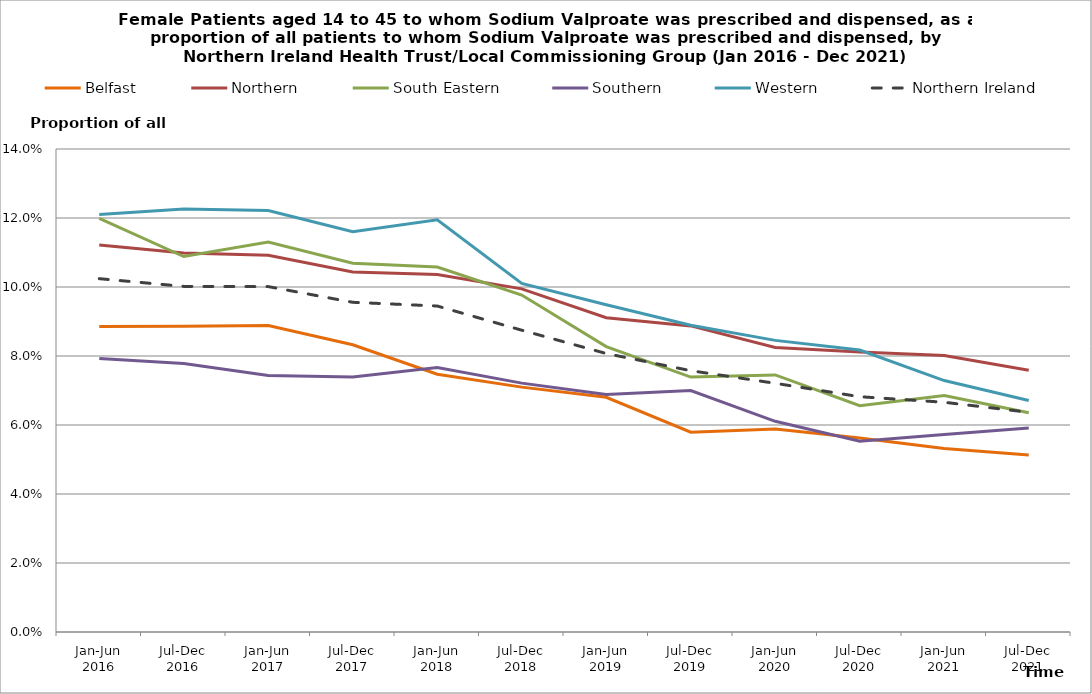
| Category | Belfast | Northern | South Eastern | Southern | Western | Northern Ireland |
|---|---|---|---|---|---|---|
| Jan-Jun 2016 | 0.089 | 0.112 | 0.12 | 0.079 | 0.121 | 0.102 |
| Jul-Dec 2016 | 0.089 | 0.11 | 0.109 | 0.078 | 0.123 | 0.1 |
| Jan-Jun 2017 | 0.089 | 0.109 | 0.113 | 0.074 | 0.122 | 0.1 |
| Jul-Dec 2017 | 0.083 | 0.104 | 0.107 | 0.074 | 0.116 | 0.096 |
| Jan-Jun 2018 | 0.075 | 0.104 | 0.106 | 0.077 | 0.119 | 0.094 |
| Jul-Dec 2018 | 0.071 | 0.099 | 0.098 | 0.072 | 0.101 | 0.087 |
| Jan-Jun 2019 | 0.068 | 0.091 | 0.083 | 0.069 | 0.095 | 0.081 |
| Jul-Dec 2019 | 0.058 | 0.089 | 0.074 | 0.07 | 0.089 | 0.076 |
| Jan-Jun 2020 | 0.059 | 0.082 | 0.075 | 0.061 | 0.085 | 0.072 |
| Jul-Dec 2020 | 0.056 | 0.081 | 0.066 | 0.055 | 0.082 | 0.068 |
| Jan-Jun 2021 | 0.053 | 0.08 | 0.069 | 0.057 | 0.073 | 0.067 |
| Jul-Dec 2021 | 0.051 | 0.076 | 0.064 | 0.059 | 0.067 | 0.064 |